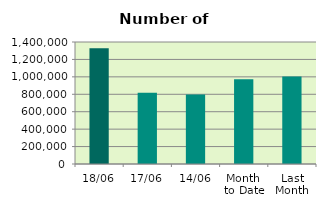
| Category | Series 0 |
|---|---|
| 18/06 | 1327196 |
| 17/06 | 818576 |
| 14/06 | 796694 |
| Month 
to Date | 972051.5 |
| Last
Month | 1004730.273 |